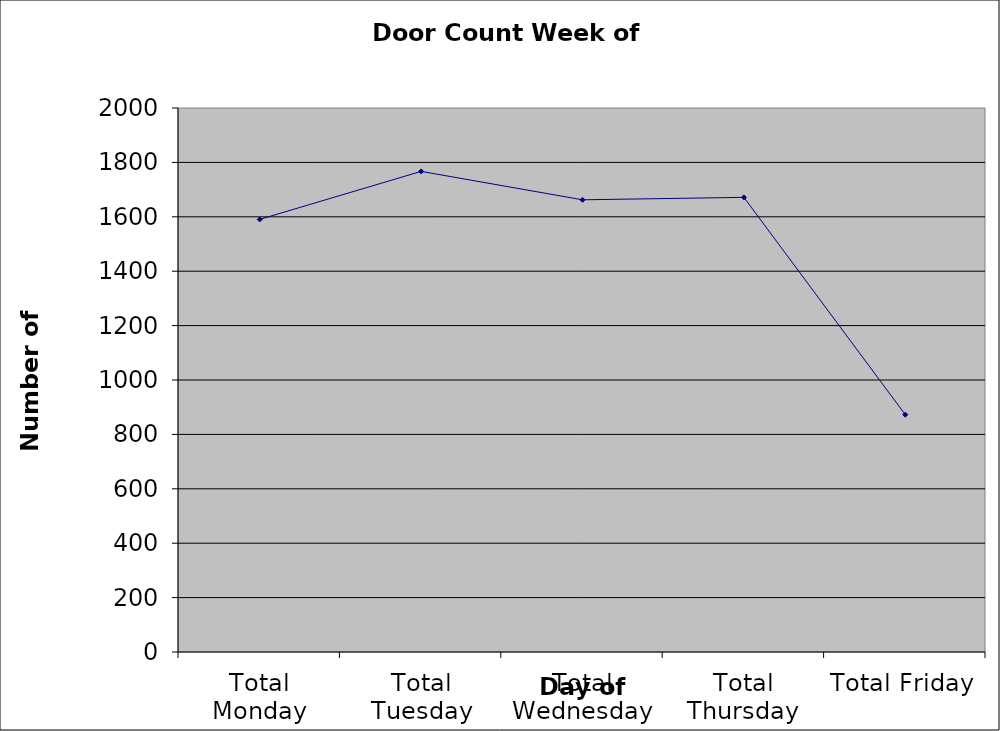
| Category | Series 0 |
|---|---|
| Total Monday | 1590.5 |
| Total Tuesday | 1767 |
| Total Wednesday | 1662.5 |
| Total Thursday | 1671.5 |
| Total Friday | 872.5 |